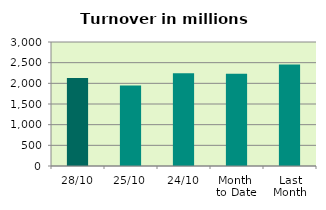
| Category | Series 0 |
|---|---|
| 28/10 | 2126.694 |
| 25/10 | 1948.902 |
| 24/10 | 2246.946 |
| Month 
to Date | 2233.086 |
| Last
Month | 2458.207 |